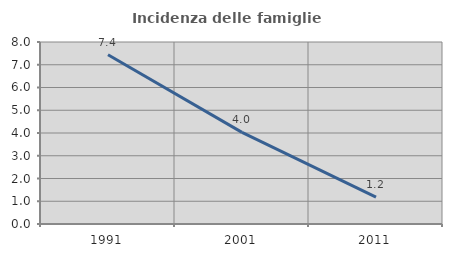
| Category | Incidenza delle famiglie numerose |
|---|---|
| 1991.0 | 7.44 |
| 2001.0 | 4.028 |
| 2011.0 | 1.182 |